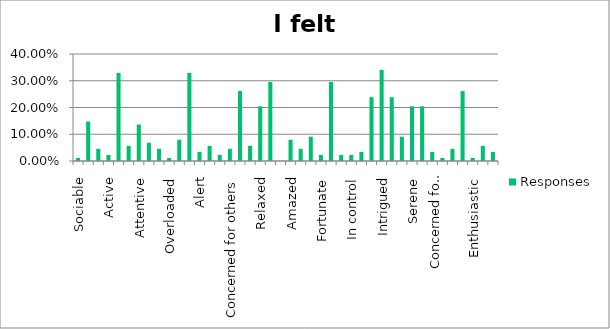
| Category | Responses |
|---|---|
| Sociable | 0.011 |
| Connected spiritually | 0.148 |
| Independent | 0.046 |
| Active | 0.023 |
| Thoughtful | 0.33 |
| Refreshed | 0.057 |
| Attentive | 0.136 |
| Excited | 0.068 |
| Concerned for nature | 0.046 |
| Overloaded | 0.011 |
| Privileged | 0.08 |
| Deep in thought | 0.33 |
| Alert | 0.034 |
| Honoured | 0.057 |
| Energetic | 0.023 |
| Concerned for others | 0.046 |
| Reflective | 0.261 |
| Reverent | 0.057 |
| Relaxed | 0.204 |
| Fascinated | 0.296 |
| Mobile | 0 |
| Amazed | 0.08 |
| Stressed | 0.046 |
| Grateful | 0.091 |
| Fortunate | 0.023 |
| Peaceful | 0.296 |
| Exhilarated | 0.023 |
| In control | 0.023 |
| Confident | 0.034 |
| Introspective | 0.239 |
| Intrigued | 0.341 |
| Tense | 0.239 |
| Concerned for the world | 0.091 |
| Serene | 0.204 |
| Uncomfortable | 0.204 |
| Vigorous | 0.034 |
| Concerned for animals | 0.011 |
| Restored | 0.046 |
| Observant | 0.261 |
| Enthusiastic | 0.011 |
| Frustrated | 0.057 |
| None of these | 0.034 |